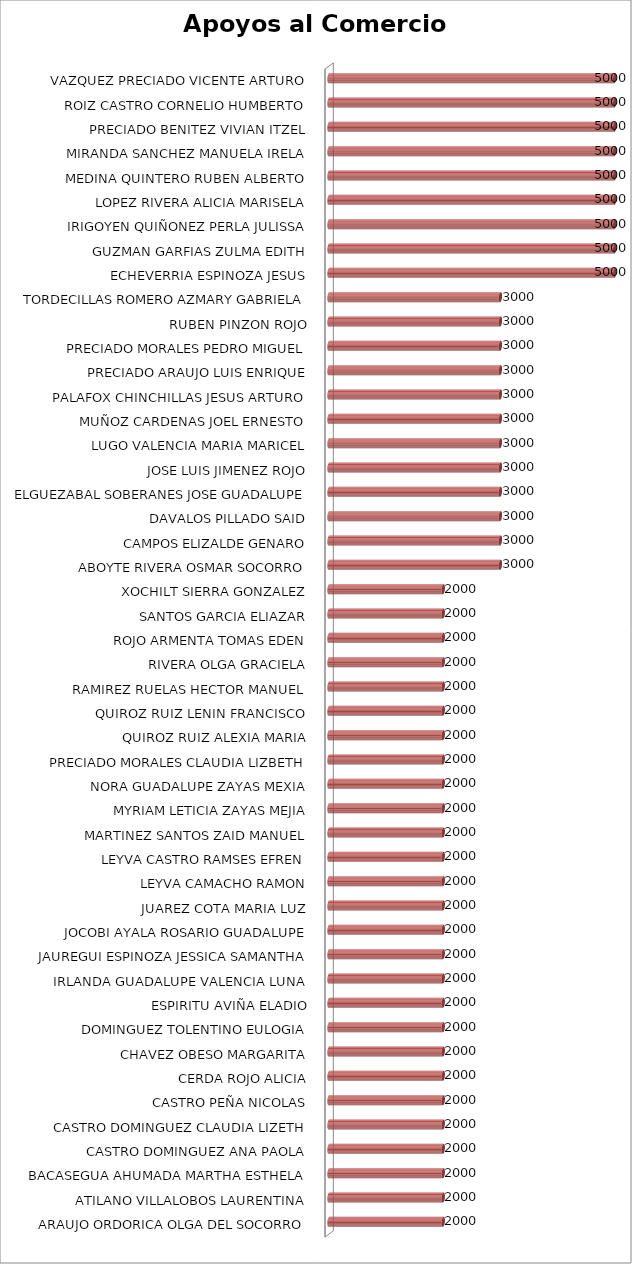
| Category | IMPORTE |
|---|---|
| ARAUJO ORDORICA OLGA DEL SOCORRO | 2000 |
| ATILANO VILLALOBOS LAURENTINA | 2000 |
| BACASEGUA AHUMADA MARTHA ESTHELA | 2000 |
| CASTRO DOMINGUEZ ANA PAOLA | 2000 |
| CASTRO DOMINGUEZ CLAUDIA LIZETH | 2000 |
| CASTRO PEÑA NICOLAS | 2000 |
| CERDA ROJO ALICIA | 2000 |
| CHAVEZ OBESO MARGARITA | 2000 |
| DOMINGUEZ TOLENTINO EULOGIA | 2000 |
| ESPIRITU AVIÑA ELADIO | 2000 |
| IRLANDA GUADALUPE VALENCIA LUNA | 2000 |
| JAUREGUI ESPINOZA JESSICA SAMANTHA | 2000 |
| JOCOBI AYALA ROSARIO GUADALUPE | 2000 |
| JUAREZ COTA MARIA LUZ | 2000 |
| LEYVA CAMACHO RAMON | 2000 |
| LEYVA CASTRO RAMSES EFREN | 2000 |
| MARTINEZ SANTOS ZAID MANUEL | 2000 |
| MYRIAM LETICIA ZAYAS MEJIA | 2000 |
| NORA GUADALUPE ZAYAS MEXIA | 2000 |
| PRECIADO MORALES CLAUDIA LIZBETH | 2000 |
| QUIROZ RUIZ ALEXIA MARIA | 2000 |
| QUIROZ RUIZ LENIN FRANCISCO | 2000 |
| RAMIREZ RUELAS HECTOR MANUEL | 2000 |
| RIVERA OLGA GRACIELA | 2000 |
| ROJO ARMENTA TOMAS EDEN | 2000 |
| SANTOS GARCIA ELIAZAR | 2000 |
| XOCHILT SIERRA GONZALEZ | 2000 |
| ABOYTE RIVERA OSMAR SOCORRO | 3000 |
| CAMPOS ELIZALDE GENARO | 3000 |
| DAVALOS PILLADO SAID | 3000 |
| ELGUEZABAL SOBERANES JOSE GUADALUPE | 3000 |
| JOSE LUIS JIMENEZ ROJO | 3000 |
| LUGO VALENCIA MARIA MARICEL | 3000 |
| MUÑOZ CARDENAS JOEL ERNESTO | 3000 |
| PALAFOX CHINCHILLAS JESUS ARTURO | 3000 |
| PRECIADO ARAUJO LUIS ENRIQUE | 3000 |
| PRECIADO MORALES PEDRO MIGUEL | 3000 |
| RUBEN PINZON ROJO | 3000 |
| TORDECILLAS ROMERO AZMARY GABRIELA | 3000 |
| ECHEVERRIA ESPINOZA JESUS | 5000 |
| GUZMAN GARFIAS ZULMA EDITH | 5000 |
| IRIGOYEN QUIÑONEZ PERLA JULISSA | 5000 |
| LOPEZ RIVERA ALICIA MARISELA | 5000 |
| MEDINA QUINTERO RUBEN ALBERTO | 5000 |
| MIRANDA SANCHEZ MANUELA IRELA | 5000 |
| PRECIADO BENITEZ VIVIAN ITZEL | 5000 |
| ROIZ CASTRO CORNELIO HUMBERTO | 5000 |
| VAZQUEZ PRECIADO VICENTE ARTURO | 5000 |